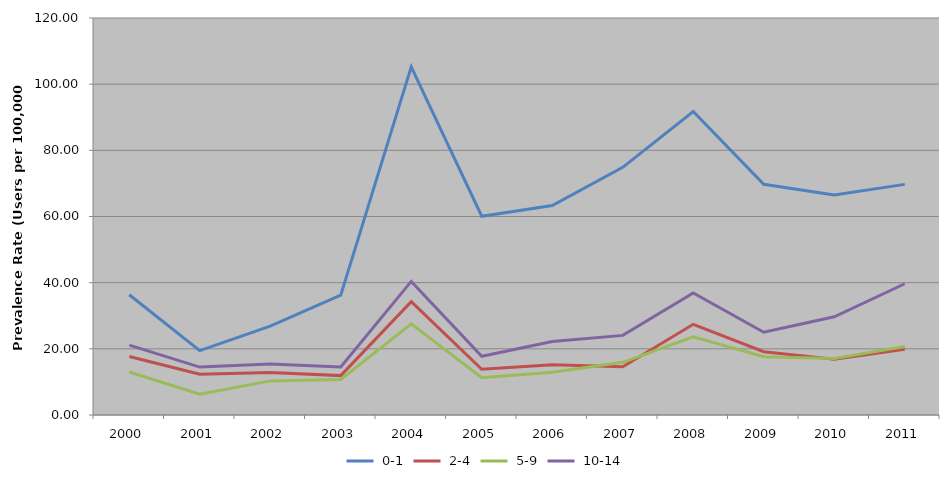
| Category |  0-1 |  2-4 |  5-9 |  10-14 |
|---|---|---|---|---|
| 2000 | 36.34 | 17.689 | 13.011 | 21.109 |
| 2001 | 19.44 | 12.341 | 6.264 | 14.479 |
| 2002 | 26.858 | 12.877 | 10.31 | 15.386 |
| 2003 | 36.204 | 11.905 | 10.737 | 14.53 |
| 2004 | 105.225 | 34.277 | 27.547 | 40.383 |
| 2005 | 60.082 | 13.803 | 11.248 | 17.763 |
| 2006 | 63.297 | 15.214 | 12.951 | 22.219 |
| 2007 | 74.853 | 14.559 | 15.914 | 24.068 |
| 2008 | 91.731 | 27.413 | 23.639 | 36.885 |
| 2009 | 69.751 | 19.114 | 17.632 | 25.027 |
| 2010 | 66.487 | 16.833 | 17.097 | 29.678 |
| 2011 | 69.711 | 19.86 | 20.717 | 39.668 |